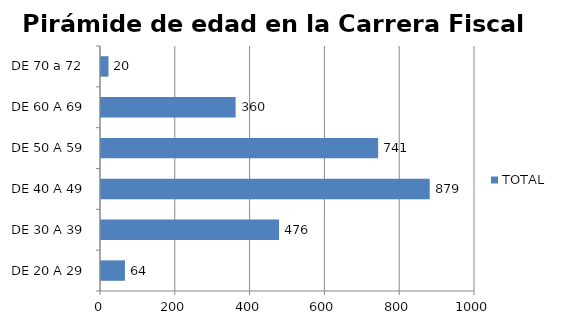
| Category | TOTAL |
|---|---|
| DE 20 A 29 | 64 |
| DE 30 A 39 | 476 |
| DE 40 A 49 | 879 |
| DE 50 A 59 | 741 |
| DE 60 A 69 | 360 |
| DE 70 a 72 | 20 |